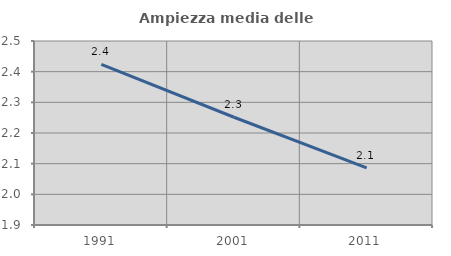
| Category | Ampiezza media delle famiglie |
|---|---|
| 1991.0 | 2.424 |
| 2001.0 | 2.251 |
| 2011.0 | 2.086 |